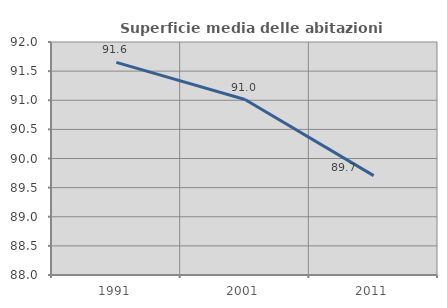
| Category | Superficie media delle abitazioni occupate |
|---|---|
| 1991.0 | 91.65 |
| 2001.0 | 91.013 |
| 2011.0 | 89.706 |